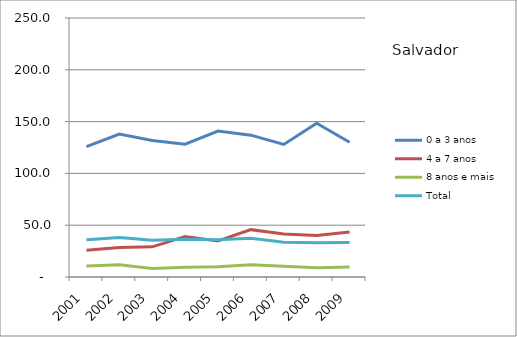
| Category | 0 a 3 anos | 4 a 7 anos | 8 anos e mais | Total |
|---|---|---|---|---|
| 2001.0 | 125.9 | 25.9 | 10.6 | 36 |
| 2002.0 | 138 | 28.4 | 11.8 | 38.1 |
| 2003.0 | 131.8 | 29.1 | 8.2 | 35.5 |
| 2004.0 | 128.2 | 39 | 9.4 | 36.5 |
| 2005.0 | 140.8 | 34.8 | 9.8 | 36 |
| 2006.0 | 136.9 | 45.7 | 11.9 | 37.5 |
| 2007.0 | 127.9 | 41.6 | 10.4 | 33.5 |
| 2008.0 | 148.4 | 40 | 8.9 | 33 |
| 2009.0 | 130 | 43.5 | 9.7 | 33.2 |